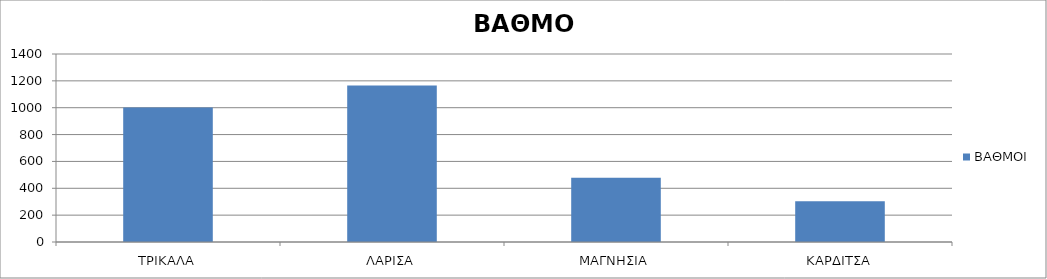
| Category | ΒΑΘΜΟΙ |
|---|---|
| ΤΡΙΚΑΛΑ | 1002 |
| ΛΑΡΙΣΑ | 1166 |
| ΜΑΓΝΗΣΙΑ | 479 |
| ΚΑΡΔΙΤΣΑ | 303 |